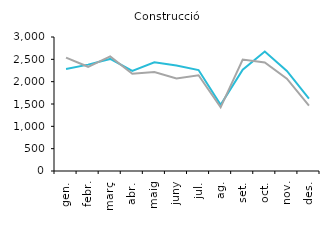
| Category | 2018 | 2019 |
|---|---|---|
| gen. | 2284 | 2539 |
| febr. | 2381 | 2333 |
| març | 2509 | 2567 |
| abr. | 2240 | 2179 |
| maig | 2434 | 2216 |
| juny | 2362 | 2071 |
| jul. | 2260 | 2144 |
| ag. | 1483 | 1425 |
| set. | 2269 | 2496 |
| oct. | 2676 | 2429 |
| nov. | 2240 | 2066 |
| des. | 1621 | 1466 |